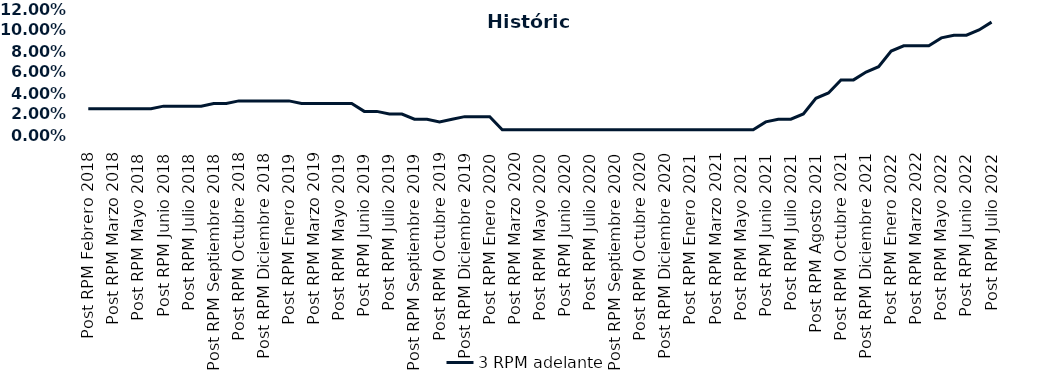
| Category | 3 RPM adelante |
|---|---|
| Post RPM Febrero 2018 | 0.025 |
| Pre RPM Marzo 2018 | 0.025 |
| Post RPM Marzo 2018 | 0.025 |
| Pre RPM Mayo 2018 | 0.025 |
| Post RPM Mayo 2018 | 0.025 |
| Pre RPM Junio 2018 | 0.025 |
| Post RPM Junio 2018 | 0.028 |
| Pre RPM Julio 2018 | 0.028 |
| Post RPM Julio 2018 | 0.028 |
| Pre RPM Septiembre 2018 | 0.028 |
| Post RPM Septiembre 2018 | 0.03 |
| Pre RPM Octubre 2018 | 0.03 |
| Post RPM Octubre 2018 | 0.032 |
| Pre RPM Diciembre 2018 | 0.032 |
| Post RPM Diciembre 2018 | 0.032 |
| Pre RPM Enero 2019 | 0.032 |
| Post RPM Enero 2019 | 0.032 |
| Pre RPM Marzo 2019 | 0.03 |
| Post RPM Marzo 2019 | 0.03 |
| Pre RPM Mayo 2019 | 0.03 |
| Post RPM Mayo 2019 | 0.03 |
| Pre RPM Junio 2019 | 0.03 |
| Post RPM Junio 2019 | 0.022 |
| Pre RPM Julio 2019 | 0.022 |
| Post RPM Julio 2019 | 0.02 |
| Pre RPM Septiembre 2019 | 0.02 |
| Post RPM Septiembre 2019 | 0.015 |
| Pre RPM Octubre 2019 | 0.015 |
| Post RPM Octubre 2019 | 0.012 |
| Pre RPM Diciembre 2019 | 0.015 |
| Post RPM Diciembre 2019 | 0.018 |
| Pre RPM Enero 2020 | 0.018 |
| Post RPM Enero 2020 | 0.018 |
| Pre RPM Marzo 2020 | 0.005 |
| Post RPM Marzo 2020 | 0.005 |
| Pre RPM Mayo 2020 | 0.005 |
| Post RPM Mayo 2020 | 0.005 |
| Pre RPM Junio 2020 | 0.005 |
| Post RPM Junio 2020 | 0.005 |
| Pre RPM Julio 2020 | 0.005 |
| Post RPM Julio 2020 | 0.005 |
| Pre RPM Septiembre 2020 | 0.005 |
| Post RPM Septiembre 2020 | 0.005 |
| Pre RPM Octubre 2020 | 0.005 |
| Post RPM Octubre 2020 | 0.005 |
| Pre RPM Diciembre 2020 | 0.005 |
| Post RPM Diciembre 2020 | 0.005 |
| Pre RPM Enero 2021 | 0.005 |
| Post RPM Enero 2021 | 0.005 |
| Pre RPM Marzo 2021 | 0.005 |
| Post RPM Marzo 2021 | 0.005 |
| Pre RPM Mayo 2021 | 0.005 |
| Post RPM Mayo 2021 | 0.005 |
| Pre RPM Junio 2021 | 0.005 |
| Post RPM Junio 2021 | 0.012 |
| Pre RPM Julio 2021 | 0.015 |
| Post RPM Julio 2021 | 0.015 |
| Pre RPM Agosto 2021 | 0.02 |
| Post RPM Agosto 2021 | 0.035 |
| Pre RPM Octubre 2021 | 0.04 |
| Post RPM Octubre 2021 | 0.052 |
| Pre RPM Diciembre 2021 | 0.052 |
| Post RPM Diciembre 2021 | 0.06 |
| Pre RPM Enero 2022 | 0.065 |
| Post RPM Enero 2022 | 0.08 |
| Pre RPM Marzo 2022 | 0.085 |
| Post RPM Marzo 2022 | 0.085 |
| Pre RPM Mayo 2022 | 0.085 |
| Post RPM Mayo 2022 | 0.092 |
| Pre RPM Junio 2022 | 0.095 |
| Post RPM Junio 2022 | 0.095 |
| Pre RPM Julio 2022 | 0.1 |
| Post RPM Julio 2022 | 0.108 |